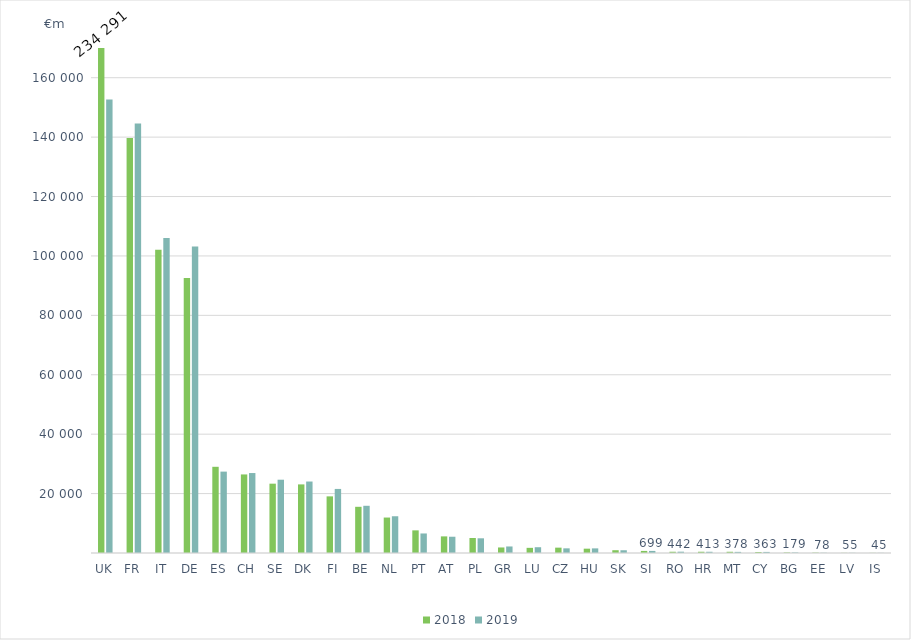
| Category | 2018 | 2019 |
|---|---|---|
| UK | 234291.443 | 152665.146 |
| FR | 139706 | 144558 |
| IT | 102048 | 106012 |
| DE | 92607 | 103218 |
| ES | 29019 | 27397 |
| CH | 26448.22 | 26917.476 |
| SE | 23337.3 | 24670.652 |
| DK | 23094.922 | 24060.219 |
| FI | 19065 | 21568 |
| BE | 15551.117 | 15892.499 |
| NL | 11936 | 12372 |
| PT | 7621.455 | 6576.477 |
| AT | 5596 | 5476 |
| PL | 5049.795 | 4948.343 |
| GR | 1865 | 2198 |
| LU | 1734.971 | 1946.158 |
| CZ | 1802.922 | 1568.679 |
| HU | 1457.346 | 1556.135 |
| SK | 939 | 925 |
| SI | 694.96 | 698.74 |
| RO | 420.205 | 442.122 |
| HR | 422.486 | 413.319 |
| MT | 414.56 | 378.26 |
| CY | 330 | 363 |
| BG | 173.331 | 178.955 |
| EE | 123.5 | 77.8 |
| LV | 48.6 | 55.2 |
| IS | 42.519 | 45.28 |